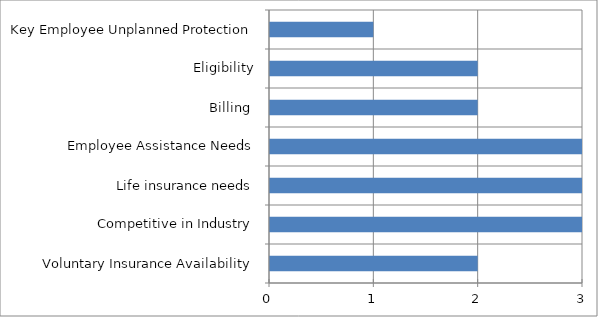
| Category | Series 0 |
|---|---|
| Voluntary Insurance Availability | 2 |
| Competitive in Industry | 3 |
| Life insurance needs | 3 |
| Employee Assistance Needs | 3 |
| Billing  | 2 |
| Eligibility | 2 |
| Key Employee Unplanned Protection | 1 |